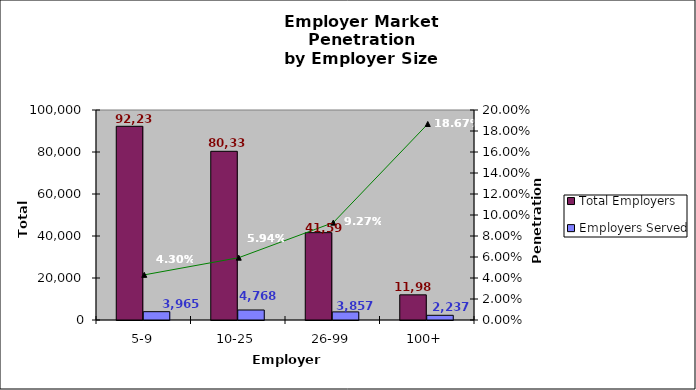
| Category | Total Employers | Employers Served |
|---|---|---|
| 5-9 | 92236 | 3965 |
| 10-25 | 80333 | 4768 |
| 26-99 | 41595 | 3857 |
| 100+ | 11983 | 2237 |